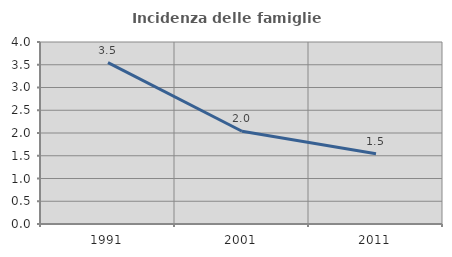
| Category | Incidenza delle famiglie numerose |
|---|---|
| 1991.0 | 3.547 |
| 2001.0 | 2.039 |
| 2011.0 | 1.542 |